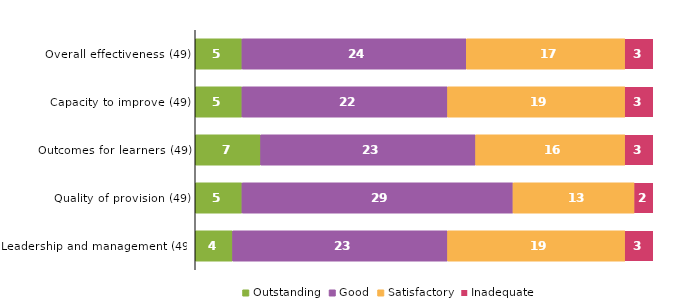
| Category | Outstanding | Good | Satisfactory | Inadequate |
|---|---|---|---|---|
| Overall effectiveness (49) | 5 | 24 | 17 | 3 |
| Capacity to improve (49) | 5 | 22 | 19 | 3 |
| Outcomes for learners (49) | 7 | 23 | 16 | 3 |
| Quality of provision (49) | 5 | 29 | 13 | 2 |
| Leadership and management (49) | 4 | 23 | 19 | 3 |